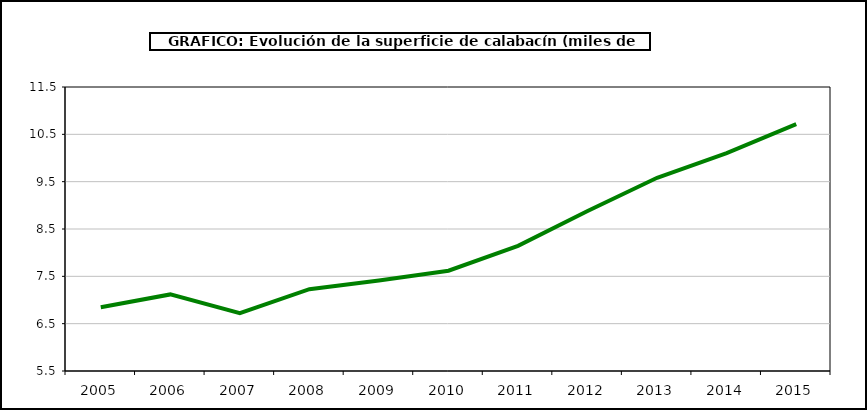
| Category | superficie |
|---|---|
| 2005.0 | 6.845 |
| 2006.0 | 7.118 |
| 2007.0 | 6.724 |
| 2008.0 | 7.229 |
| 2009.0 | 7.41 |
| 2010.0 | 7.618 |
| 2011.0 | 8.144 |
| 2012.0 | 8.879 |
| 2013.0 | 9.582 |
| 2014.0 | 10.102 |
| 2015.0 | 10.717 |